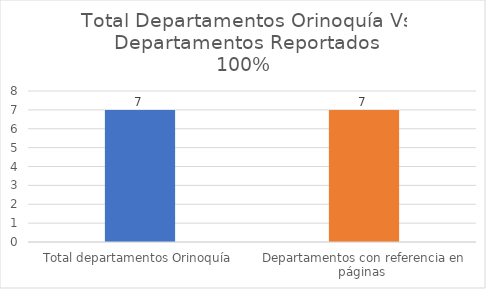
| Category | Series 0 |
|---|---|
| Total departamentos Orinoquía | 7 |
| Departamentos con referencia en páginas  | 7 |